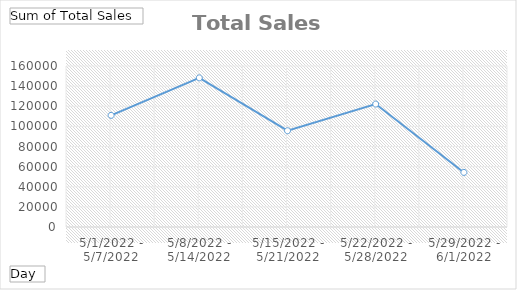
| Category | Total |
|---|---|
| 5/1/2022 - 5/7/2022 | 110962 |
| 5/8/2022 - 5/14/2022 | 148199 |
| 5/15/2022 - 5/21/2022 | 95676 |
| 5/22/2022 - 5/28/2022 | 122177 |
| 5/29/2022 - 6/1/2022 | 54245 |